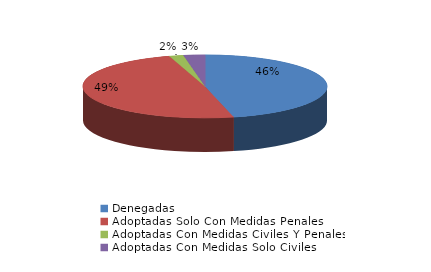
| Category | Series 0 |
|---|---|
| Denegadas | 49 |
| Adoptadas Solo Con Medidas Penales | 52 |
| Adoptadas Con Medidas Civiles Y Penales | 2 |
| Adoptadas Con Medidas Solo Civiles | 3 |